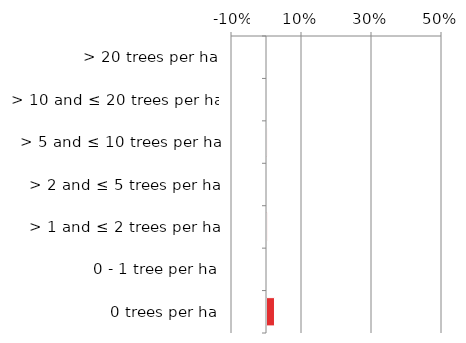
| Category | Near native & fragments |
|---|---|
| 0 trees per ha | 0.021 |
| 0 - 1 tree per ha | 0 |
| > 1 and ≤ 2 trees per ha | 0.001 |
| > 2 and ≤ 5 trees per ha | 0 |
| > 5 and ≤ 10 trees per ha | 0 |
| > 10 and ≤ 20 trees per ha | 0 |
| > 20 trees per ha | 0 |